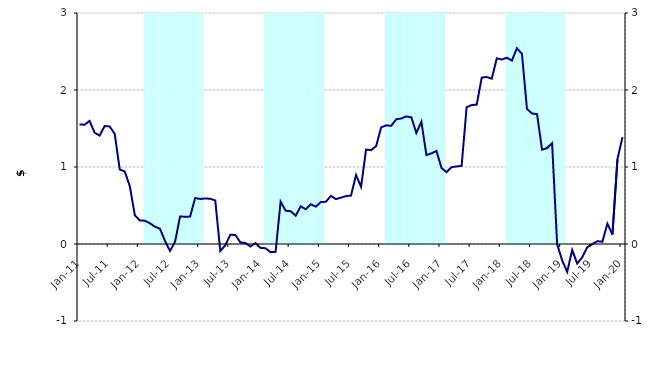
| Category | Series 1 |
|---|---|
| 0 | 0 |
| 1900-01-01 | 0 |
| 1900-01-02 | 0 |
| 1900-01-03 | 0 |
| 1900-01-04 | 0 |
| 1900-01-05 | 0 |
| 1900-01-06 | 0 |
| 1900-01-07 | 0 |
| 1900-01-08 | 0 |
| 1900-01-09 | 0 |
| 1900-01-10 | 0 |
| 1900-01-11 | 0 |
| 1900-01-12 | 0 |
| 1900-01-13 | 3000000 |
| 1900-01-14 | 3000000 |
| 1900-01-15 | 3000000 |
| 1900-01-16 | 3000000 |
| 1900-01-17 | 3000000 |
| 1900-01-18 | 3000000 |
| 1900-01-19 | 3000000 |
| 1900-01-20 | 3000000 |
| 1900-01-21 | 3000000 |
| 1900-01-22 | 3000000 |
| 1900-01-23 | 3000000 |
| 1900-01-24 | 3000000 |
| 1900-01-25 | 0 |
| 1900-01-26 | 0 |
| 1900-01-27 | 0 |
| 1900-01-28 | 0 |
| 1900-01-29 | 0 |
| 1900-01-30 | 0 |
| 1900-01-31 | 0 |
| 1900-02-01 | 0 |
| 1900-02-02 | 0 |
| 1900-02-03 | 0 |
| 1900-02-04 | 0 |
| 1900-02-05 | 0 |
| 1900-02-06 | 3000000 |
| 1900-02-07 | 3000000 |
| 1900-02-08 | 3000000 |
| 1900-02-09 | 3000000 |
| 1900-02-10 | 3000000 |
| 1900-02-11 | 3000000 |
| 1900-02-12 | 3000000 |
| 1900-02-13 | 3000000 |
| 1900-02-14 | 3000000 |
| 1900-02-15 | 3000000 |
| 1900-02-16 | 3000000 |
| 1900-02-17 | 3000000 |
| 1900-02-18 | 0 |
| 1900-02-19 | 0 |
| 1900-02-20 | 0 |
| 1900-02-21 | 0 |
| 1900-02-22 | 0 |
| 1900-02-23 | 0 |
| 1900-02-24 | 0 |
| 1900-02-25 | 0 |
| 1900-02-26 | 0 |
| 1900-02-27 | 0 |
| 1900-02-28 | 0 |
| 1900-02-28 | 0 |
| 1900-03-01 | 3000000 |
| 1900-03-02 | 3000000 |
| 1900-03-03 | 3000000 |
| 1900-03-04 | 3000000 |
| 1900-03-05 | 3000000 |
| 1900-03-06 | 3000000 |
| 1900-03-07 | 3000000 |
| 1900-03-08 | 3000000 |
| 1900-03-09 | 3000000 |
| 1900-03-10 | 3000000 |
| 1900-03-11 | 3000000 |
| 1900-03-12 | 3000000 |
| 1900-03-13 | 0 |
| 1900-03-14 | 0 |
| 1900-03-15 | 0 |
| 1900-03-16 | 0 |
| 1900-03-17 | 0 |
| 1900-03-18 | 0 |
| 1900-03-19 | 0 |
| 1900-03-20 | 0 |
| 1900-03-21 | 0 |
| 1900-03-22 | 0 |
| 1900-03-23 | 0 |
| 1900-03-24 | 0 |
| 1900-03-25 | 3000000 |
| 1900-03-26 | 3000000 |
| 1900-03-27 | 3000000 |
| 1900-03-28 | 3000000 |
| 1900-03-29 | 3000000 |
| 1900-03-30 | 3000000 |
| 1900-03-31 | 3000000 |
| 1900-04-01 | 3000000 |
| 1900-04-02 | 3000000 |
| 1900-04-03 | 3000000 |
| 1900-04-04 | 3000000 |
| 1900-04-05 | 3000000 |
| 1900-04-06 | 0 |
| 1900-04-07 | 0 |
| 1900-04-08 | 0 |
| 1900-04-09 | 0 |
| 1900-04-10 | 0 |
| 1900-04-11 | 0 |
| 1900-04-12 | 0 |
| 1900-04-13 | 0 |
| 1900-04-14 | 0 |
| 1900-04-15 | 0 |
| 1900-04-16 | 0 |
| 1900-04-17 | 0 |